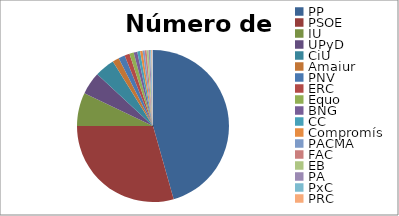
| Category | Votos |
|---|---|
| PP | 10866566 |
| PSOE | 7003511 |
| IU | 1685991 |
| UPyD | 1143225 |
| CiU | 1015691 |
| Amaiur | 334498 |
| PNV | 324317 |
| ERC | 256393 |
| Equo | 216748 |
| BNG | 184037 |
| CC | 143881 |
| Compromís | 125306 |
| PACMA | 102144 |
| FAC | 99473 |
| EB | 97673 |
| PA | 76999 |
| PxC | 59949 |
| PRC | 44010 |
| GB | 42415 |